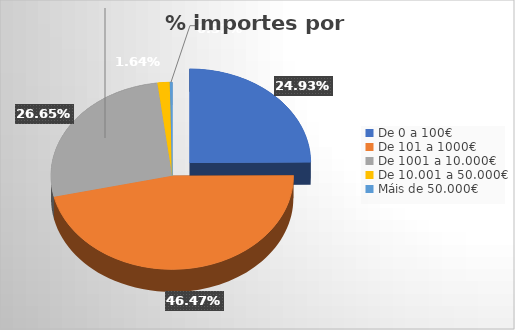
| Category | Series 1 | Series 2 | Series 3 | Series 4 |
|---|---|---|---|---|
| De 0 a 100€ | 0.024 | 0.159 | 0.01 | 0.363 |
| De 101 a 1000€ | 0.045 | 0.121 | 0.027 | 0.441 |
| De 1001 a 10.000€ | 0.026 | 0.056 | 0.011 | 0.174 |
| De 10.001 a 50.000€ | 0.002 | 0.009 | 0.001 | 0.017 |
| Máis de 50.000€ | 0 | 0.003 | 0 | 0.004 |